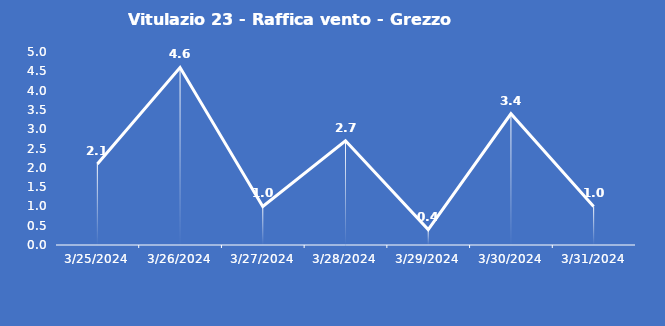
| Category | Vitulazio 23 - Raffica vento - Grezzo (m/s) |
|---|---|
| 3/25/24 | 2.1 |
| 3/26/24 | 4.6 |
| 3/27/24 | 1 |
| 3/28/24 | 2.7 |
| 3/29/24 | 0.4 |
| 3/30/24 | 3.4 |
| 3/31/24 | 1 |